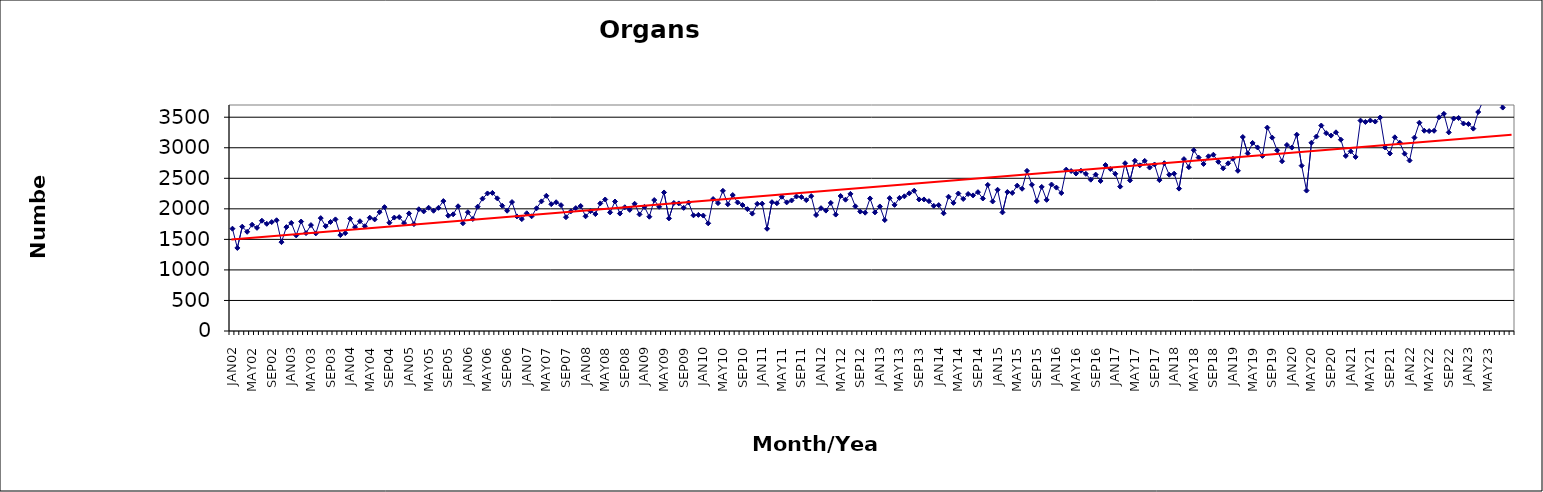
| Category | Series 0 |
|---|---|
| JAN02 | 1675 |
| FEB02 | 1360 |
| MAR02 | 1708 |
| APR02 | 1624 |
| MAY02 | 1740 |
| JUN02 | 1689 |
| JUL02 | 1806 |
| AUG02 | 1755 |
| SEP02 | 1783 |
| OCT02 | 1813 |
| NOV02 | 1455 |
| DEC02 | 1701 |
| JAN03 | 1770 |
| FEB03 | 1565 |
| MAR03 | 1792 |
| APR03 | 1603 |
| MAY03 | 1734 |
| JUN03 | 1598 |
| JUL03 | 1848 |
| AUG03 | 1716 |
| SEP03 | 1785 |
| OCT03 | 1827 |
| NOV03 | 1570 |
| DEC03 | 1602 |
| JAN04 | 1839 |
| FEB04 | 1700 |
| MAR04 | 1797 |
| APR04 | 1715 |
| MAY04 | 1855 |
| JUN04 | 1827 |
| JUL04 | 1946 |
| AUG04 | 2028 |
| SEP04 | 1773 |
| OCT04 | 1857 |
| NOV04 | 1864 |
| DEC04 | 1766 |
| JAN05 | 1925 |
| FEB05 | 1750 |
| MAR05 | 1993 |
| APR05 | 1958 |
| MAY05 | 2018 |
| JUN05 | 1969 |
| JUL05 | 2016 |
| AUG05 | 2127 |
| SEP05 | 1888 |
| OCT05 | 1910 |
| NOV05 | 2042 |
| DEC05 | 1764 |
| JAN06 | 1945 |
| FEB06 | 1834 |
| MAR06 | 2035 |
| APR06 | 2167 |
| MAY06 | 2252 |
| JUN06 | 2261 |
| JUL06 | 2172 |
| AUG06 | 2051 |
| SEP06 | 1969 |
| OCT06 | 2111 |
| NOV06 | 1876 |
| DEC06 | 1832 |
| JAN07 | 1927 |
| FEB07 | 1878 |
| MAR07 | 2009 |
| APR07 | 2122 |
| MAY07 | 2214 |
| JUN07 | 2076 |
| JUL07 | 2108 |
| AUG07 | 2060 |
| SEP07 | 1863 |
| OCT07 | 1959 |
| NOV07 | 2012 |
| DEC07 | 2046 |
| JAN08 | 1878 |
| FEB08 | 1962 |
| MAR08 | 1914 |
| APR08 | 2089 |
| MAY08 | 2153 |
| JUN08 | 1942 |
| JUL08 | 2120 |
| AUG08 | 1923 |
| SEP08 | 2026 |
| OCT08 | 1983 |
| NOV08 | 2083 |
| DEC08 | 1909 |
| JAN09 | 2033 |
| FEB09 | 1871 |
| MAR09 | 2144 |
| APR09 | 2033 |
| MAY09 | 2268 |
| JUN09 | 1844 |
| JUL09 | 2096 |
| AUG09 | 2089 |
| SEP09 | 2016 |
| OCT09 | 2104 |
| NOV09 | 1894 |
| DEC09 | 1901 |
| JAN10 | 1890 |
| FEB10 | 1763 |
| MAR10 | 2160 |
| APR10 | 2094 |
| MAY10 | 2295 |
| JUN10 | 2075 |
| JUL10 | 2226 |
| AUG10 | 2105 |
| SEP10 | 2062 |
| OCT10 | 1995 |
| NOV10 | 1922 |
| DEC10 | 2082 |
| JAN11 | 2085 |
| FEB11 | 1674 |
| MAR11 | 2109 |
| APR11 | 2091 |
| MAY11 | 2198 |
| JUN11 | 2106 |
| JUL11 | 2137 |
| AUG11 | 2202 |
| SEP11 | 2193 |
| OCT11 | 2143 |
| NOV11 | 2208 |
| DEC11 | 1899 |
| JAN12 | 2011 |
| FEB12 | 1971 |
| MAR12 | 2097 |
| APR12 | 1906 |
| MAY12 | 2210 |
| JUN12 | 2150 |
| JUL12 | 2245 |
| AUG12 | 2041 |
| SEP12 | 1955 |
| OCT12 | 1937 |
| NOV12 | 2170 |
| DEC12 | 1942 |
| JAN13 | 2039 |
| FEB13 | 1817 |
| MAR13 | 2175 |
| APR13 | 2065 |
| MAY13 | 2179 |
| JUN13 | 2205 |
| JUL13 | 2254 |
| AUG13 | 2297 |
| SEP13 | 2154 |
| OCT13 | 2154 |
| NOV13 | 2126 |
| DEC13 | 2049 |
| JAN14 | 2061 |
| FEB14 | 1927 |
| MAR14 | 2198 |
| APR14 | 2098 |
| MAY14 | 2251 |
| JUN14 | 2162 |
| JUL14 | 2243 |
| AUG14 | 2220 |
| SEP14 | 2273 |
| OCT14 | 2169 |
| NOV14 | 2392 |
| DEC14 | 2121 |
| JAN15 | 2312 |
| FEB15 | 1942 |
| MAR15 | 2275 |
| APR15 | 2260 |
| MAY15 | 2380 |
| JUN15 | 2329 |
| JUL15 | 2622 |
| AUG15 | 2394 |
| SEP15 | 2127 |
| OCT15 | 2359 |
| NOV15 | 2147 |
| DEC15 | 2398 |
| JAN16 | 2348 |
| FEB16 | 2259 |
| MAR16 | 2642 |
| APR16 | 2619 |
| MAY16 | 2578 |
| JUN16 | 2624 |
| JUL16 | 2573 |
| AUG16 | 2477 |
| SEP16 | 2560 |
| OCT16 | 2456 |
| NOV16 | 2717 |
| DEC16 | 2652 |
| JAN17 | 2574 |
| FEB17 | 2364 |
| MAR17 | 2747 |
| APR17 | 2466 |
| MAY17 | 2787 |
| JUN17 | 2713 |
| JUL17 | 2785 |
| AUG17 | 2676 |
| SEP17 | 2726 |
| OCT17 | 2470 |
| NOV17 | 2747 |
| DEC17 | 2558 |
| JAN18 | 2576 |
| FEB18 | 2331 |
| MAR18 | 2814 |
| APR18 | 2682 |
| MAY18 | 2960 |
| JUN18 | 2839 |
| JUL18 | 2735 |
| AUG18 | 2860 |
| SEP18 | 2886 |
| OCT18 | 2770 |
| NOV18 | 2663 |
| DEC18 | 2745 |
| JAN19 | 2820 |
| FEB19 | 2623 |
| MAR19 | 3176 |
| APR19 | 2907 |
| MAY19 | 3079 |
| JUN19 | 3005 |
| JUL19 | 2867 |
| AUG19 | 3330 |
| SEP19 | 3166 |
| OCT19 | 2958 |
| NOV19 | 2779 |
| DEC19 | 3045 |
| JAN20 | 3003 |
| FEB20 | 3214 |
| MAR20 | 2707 |
| APR20 | 2299 |
| MAY20 | 3082 |
| JUN20 | 3183 |
| JUL20 | 3364 |
| AUG20 | 3239 |
| SEP20 | 3199 |
| OCT20 | 3253 |
| NOV20 | 3132 |
| DEC20 | 2866 |
| JAN21 | 2940 |
| FEB21 | 2850 |
| MAR21 | 3445 |
| APR21 | 3422 |
| MAY21 | 3446 |
| JUN21 | 3429 |
| JUL21 | 3494 |
| AUG21 | 3006 |
| SEP21 | 2906 |
| OCT21 | 3171 |
| NOV21 | 3083 |
| DEC21 | 2903 |
| JAN22 | 2791 |
| FEB22 | 3166 |
| MAR22 | 3410 |
| APR22 | 3279 |
| MAY22 | 3273 |
| JUN22 | 3278 |
| JUL22 | 3499 |
| AUG22 | 3555 |
| SEP22 | 3252 |
| OCT22 | 3479 |
| NOV22 | 3487 |
| DEC22 | 3397 |
| JAN23 | 3388 |
| FEB23 | 3313 |
| MAR23 | 3585 |
| APR23 | 3772 |
| MAY23 | 3910 |
| JUN23 | 3757 |
| JUL23 | 3822 |
| AUG23 | 3658 |